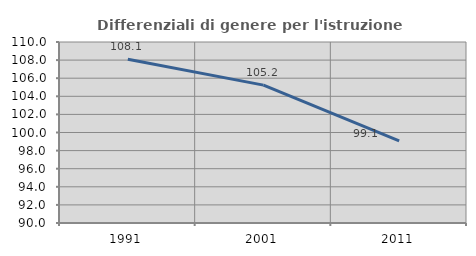
| Category | Differenziali di genere per l'istruzione superiore |
|---|---|
| 1991.0 | 108.092 |
| 2001.0 | 105.233 |
| 2011.0 | 99.063 |